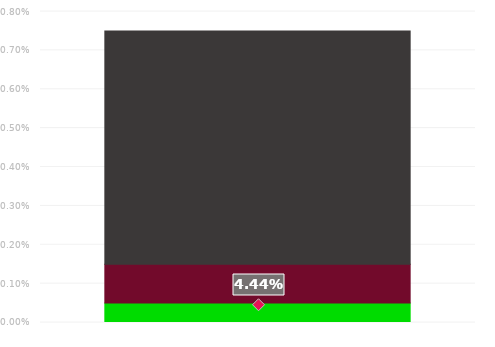
| Category | Series 1 | Series 2 | Series 3 |
|---|---|---|---|
| 0.044371340113722166 | 0.05 | 0.1 | 0.6 |